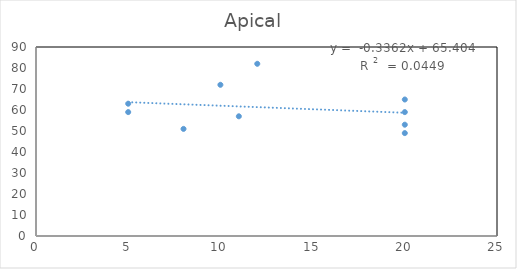
| Category | Apical  |
|---|---|
| 5.0 | 63 |
| 11.0 | 57 |
| 5.0 | 59 |
| 12.0 | 82 |
| 20.0 | 59 |
| 20.0 | 65 |
| 20.0 | 49 |
| 20.0 | 53 |
| 10.0 | 72 |
| 8.0 | 51 |